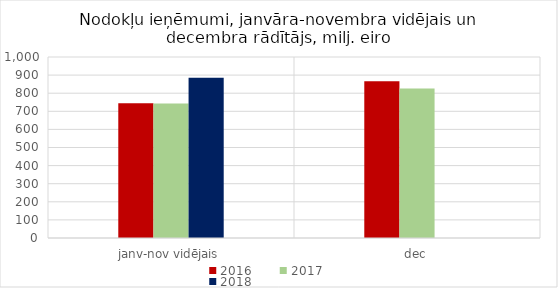
| Category | 2016 | 2017 | 2018 |
|---|---|---|---|
| janv-nov vidējais | 744687.411 | 743640.949 | 884874.19 |
| dec | 865773.712 | 826496.37 | 0 |